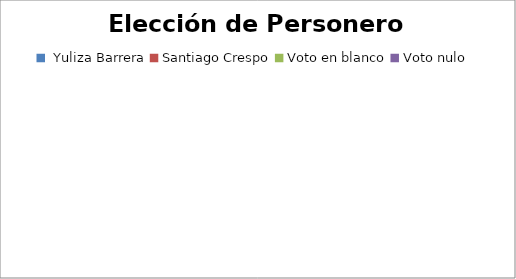
| Category | Series 0 |
|---|---|
|  Yuliza Barrera | 0 |
| Santiago Crespo | 0 |
| Voto en blanco | 0 |
| Voto nulo | 0 |